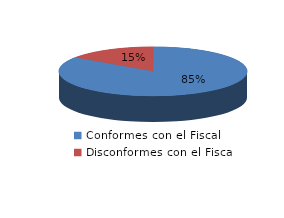
| Category | Series 0 |
|---|---|
| 0 | 11 |
| 1 | 2 |